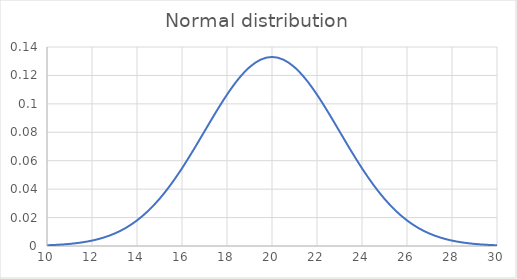
| Category | y |
|---|---|
| 10.0 | 0.001 |
| 10.5 | 0.001 |
| 11.0 | 0.001 |
| 11.5 | 0.002 |
| 12.0 | 0.004 |
| 12.5 | 0.006 |
| 13.0 | 0.009 |
| 13.5 | 0.013 |
| 14.0 | 0.018 |
| 14.5 | 0.025 |
| 15.0 | 0.033 |
| 15.5 | 0.043 |
| 16.0 | 0.055 |
| 16.5 | 0.067 |
| 17.0 | 0.081 |
| 17.5 | 0.094 |
| 18.0 | 0.106 |
| 18.5 | 0.117 |
| 19.0 | 0.126 |
| 19.5 | 0.131 |
| 20.0 | 0.133 |
| 20.5 | 0.131 |
| 21.0 | 0.126 |
| 21.5 | 0.117 |
| 22.0 | 0.106 |
| 22.5 | 0.094 |
| 23.0 | 0.081 |
| 23.5 | 0.067 |
| 24.0 | 0.055 |
| 24.5 | 0.043 |
| 25.0 | 0.033 |
| 25.5 | 0.025 |
| 26.0 | 0.018 |
| 26.5 | 0.013 |
| 27.0 | 0.009 |
| 27.5 | 0.006 |
| 28.0 | 0.004 |
| 28.5 | 0.002 |
| 29.0 | 0.001 |
| 29.5 | 0.001 |
| 30.0 | 0.001 |
| 30.5 | 0 |
| 31.0 | 0 |
| 31.5 | 0 |
| 32.0 | 0 |
| 32.5 | 0 |
| 33.0 | 0 |
| 33.5 | 0 |
| 34.0 | 0 |
| 34.5 | 0 |
| 35.0 | 0 |
| 35.5 | 0 |
| 36.0 | 0 |
| 36.5 | 0 |
| 37.0 | 0 |
| 37.5 | 0 |
| 38.0 | 0 |
| 38.5 | 0 |
| 39.0 | 0 |
| 39.5 | 0 |
| 40.0 | 0 |